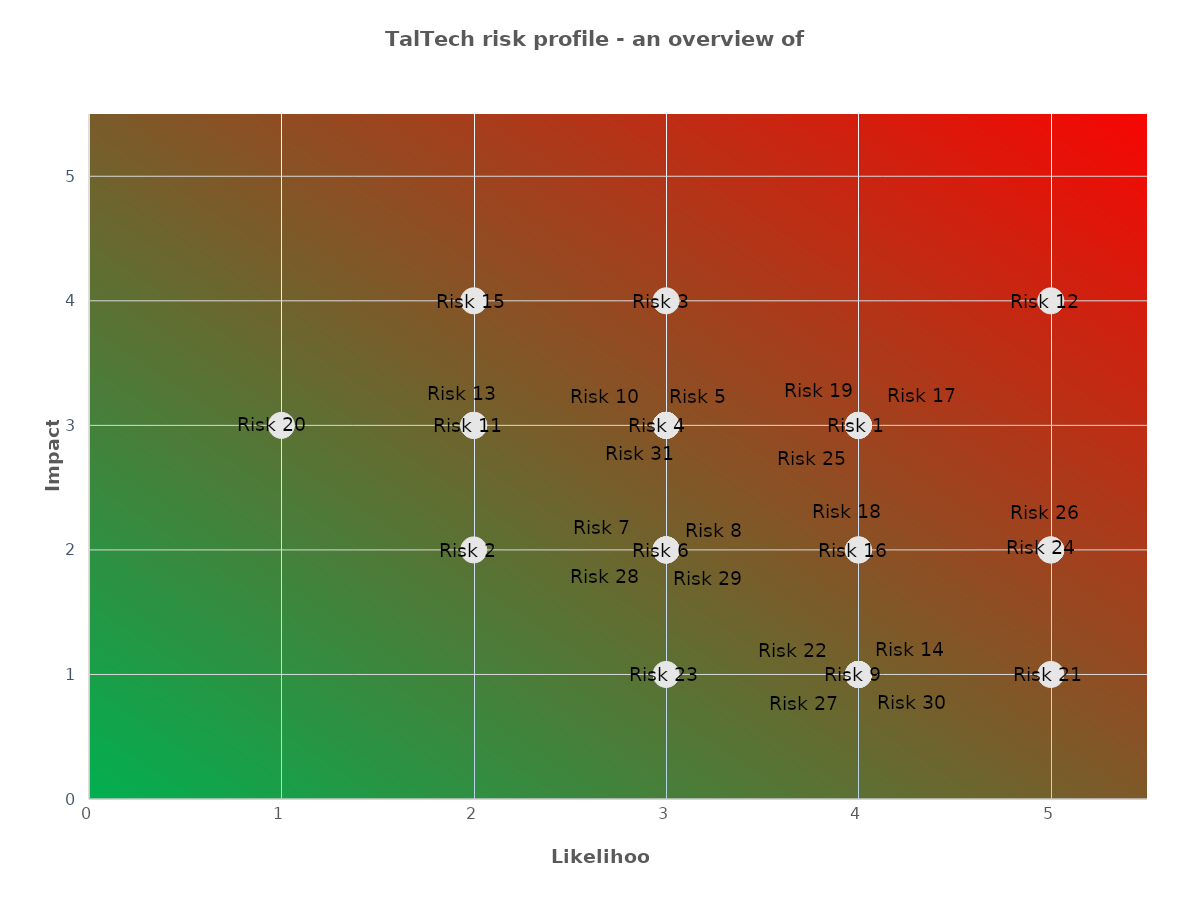
| Category | Risk 1 |
|---|---|
| 4.0 | 3 |
| 2.0 | 2 |
| 3.0 | 4 |
| 3.0 | 3 |
| 3.0 | 3 |
| 3.0 | 2 |
| 3.0 | 2 |
| 3.0 | 2 |
| 4.0 | 1 |
| 3.0 | 3 |
| 2.0 | 3 |
| 5.0 | 4 |
| 2.0 | 3 |
| 4.0 | 1 |
| 2.0 | 4 |
| 4.0 | 2 |
| 4.0 | 3 |
| 4.0 | 2 |
| 4.0 | 3 |
| 1.0 | 3 |
| 5.0 | 1 |
| 4.0 | 1 |
| 3.0 | 1 |
| 5.0 | 2 |
| 4.0 | 3 |
| 5.0 | 2 |
| 4.0 | 1 |
| 3.0 | 2 |
| 3.0 | 2 |
| 4.0 | 1 |
| 3.0 | 3 |